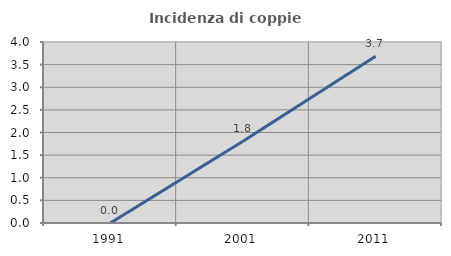
| Category | Incidenza di coppie miste |
|---|---|
| 1991.0 | 0 |
| 2001.0 | 1.807 |
| 2011.0 | 3.687 |